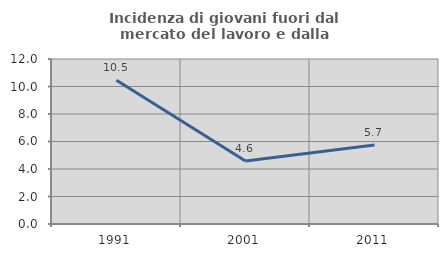
| Category | Incidenza di giovani fuori dal mercato del lavoro e dalla formazione  |
|---|---|
| 1991.0 | 10.455 |
| 2001.0 | 4.587 |
| 2011.0 | 5.741 |